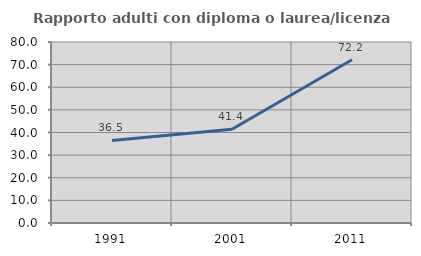
| Category | Rapporto adulti con diploma o laurea/licenza media  |
|---|---|
| 1991.0 | 36.502 |
| 2001.0 | 41.433 |
| 2011.0 | 72.173 |